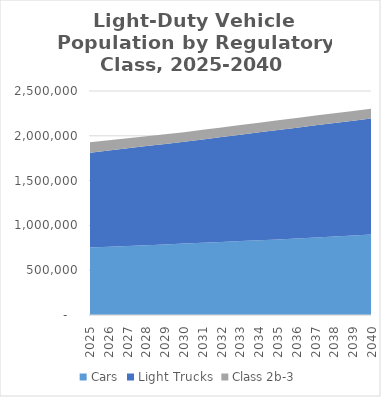
| Category | Cars | Light Trucks | Class 2b-3 |
|---|---|---|---|
| 2025.0 | 752459.381 | 1059140.723 | 115241.699 |
| 2026.0 | 761400 | 1074610 | 113620 |
| 2027.0 | 770340 | 1090080 | 111990 |
| 2028.0 | 779280 | 1105550 | 110370 |
| 2029.0 | 788220 | 1121020 | 108740 |
| 2030.0 | 797165.338 | 1136490.629 | 107115.191 |
| 2031.0 | 806400 | 1153580 | 107350 |
| 2032.0 | 815630 | 1170670 | 107580 |
| 2033.0 | 824860 | 1187760 | 107810 |
| 2034.0 | 834090 | 1204850 | 108050 |
| 2035.0 | 843321.001 | 1221938.405 | 108280.193 |
| 2036.0 | 854640 | 1236370 | 108480 |
| 2037.0 | 865960 | 1250790 | 108690 |
| 2038.0 | 877270 | 1265220 | 108890 |
| 2039.0 | 888590 | 1279650 | 109100 |
| 2040.0 | 899908.149 | 1294071.783 | 109301.747 |